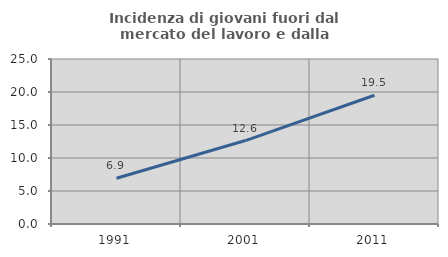
| Category | Incidenza di giovani fuori dal mercato del lavoro e dalla formazione  |
|---|---|
| 1991.0 | 6.934 |
| 2001.0 | 12.644 |
| 2011.0 | 19.512 |